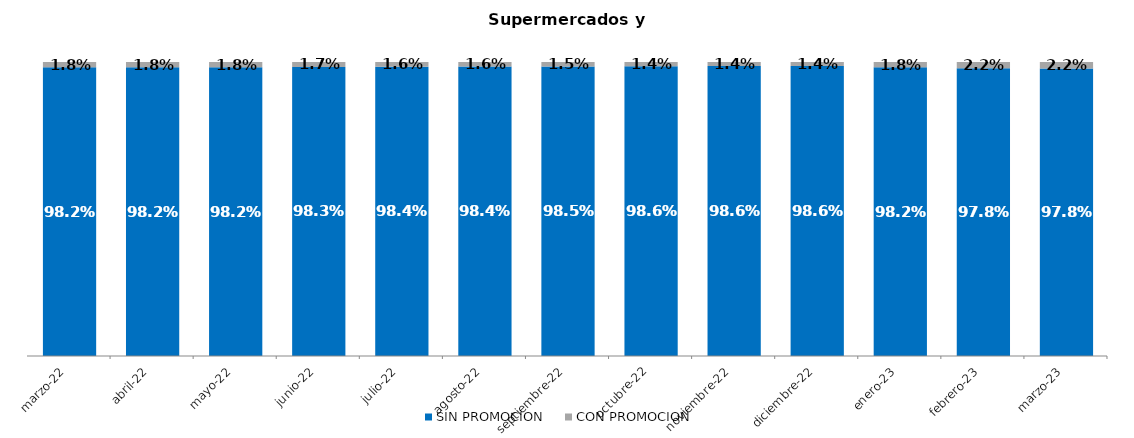
| Category | SIN PROMOCION   | CON PROMOCION   |
|---|---|---|
| 2022-03-01 | 0.982 | 0.018 |
| 2022-04-01 | 0.982 | 0.018 |
| 2022-05-01 | 0.982 | 0.018 |
| 2022-06-01 | 0.983 | 0.017 |
| 2022-07-01 | 0.984 | 0.016 |
| 2022-08-01 | 0.984 | 0.016 |
| 2022-09-01 | 0.985 | 0.015 |
| 2022-10-01 | 0.986 | 0.014 |
| 2022-11-01 | 0.986 | 0.014 |
| 2022-12-01 | 0.986 | 0.014 |
| 2023-01-01 | 0.982 | 0.018 |
| 2023-02-01 | 0.978 | 0.022 |
| 2023-03-01 | 0.978 | 0.022 |